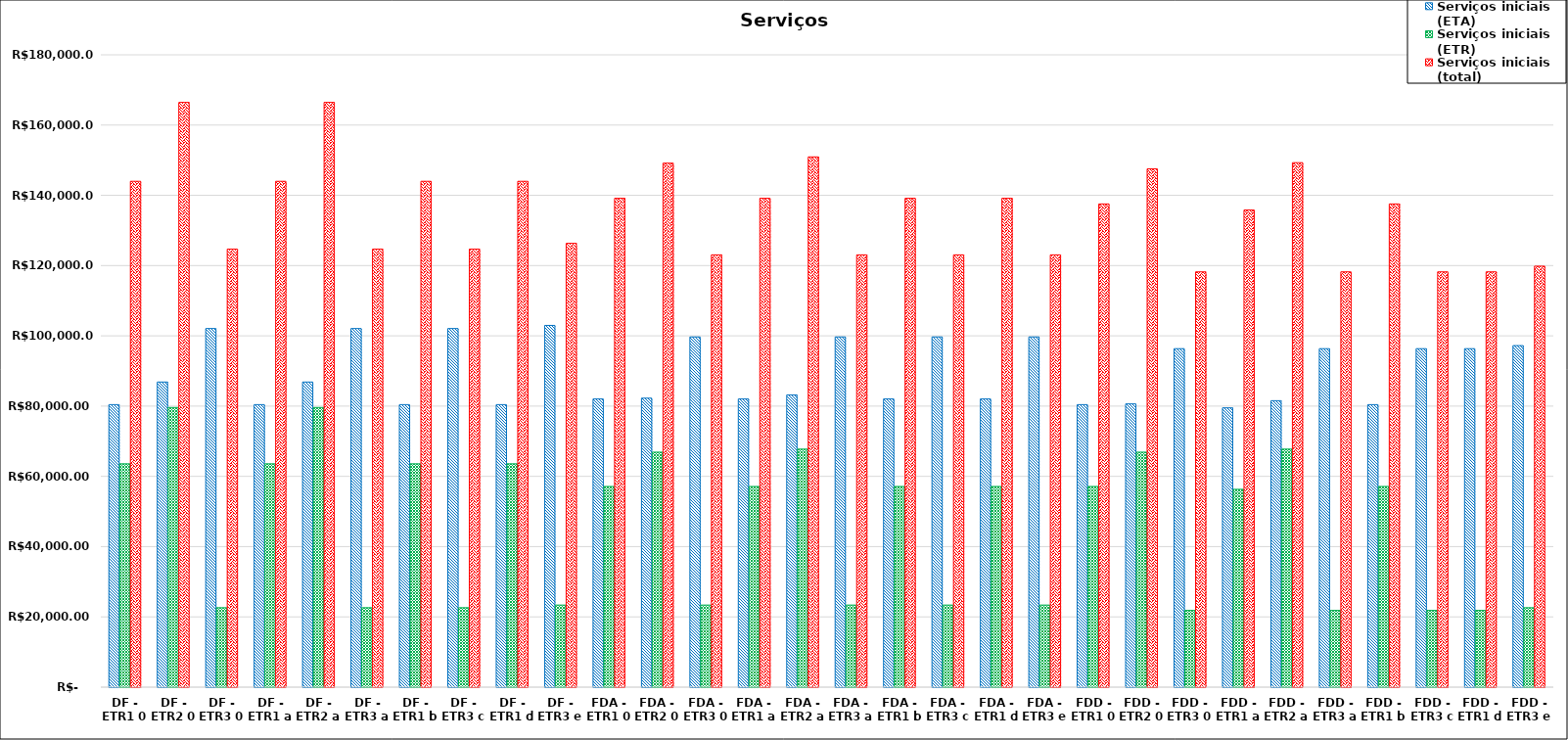
| Category | Serviços iniciais (ETA) | Serviços iniciais (ETR) | Serviços iniciais (total) |
|---|---|---|---|
| DF - ETR1 0 | 80421.026 | 63570.661 | 143991.687 |
| DF - ETR2 0 | 86855.839 | 79599.632 | 166455.471 |
| DF - ETR3 0 | 102079.858 | 22614.206 | 124694.064 |
| DF - ETR1 a | 80421.026 | 63570.661 | 143991.687 |
| DF - ETR2 a | 86855.839 | 79599.632 | 166455.471 |
| DF - ETR3 a | 102080.155 | 22614.206 | 124694.361 |
| DF - ETR1 b | 80421.026 | 63570.661 | 143991.687 |
| DF - ETR3 c | 102080.155 | 22614.206 | 124694.361 |
| DF - ETR1 d | 80421.026 | 63570.661 | 143991.687 |
| DF - ETR3 e | 102969.684 | 23364.995 | 126334.679 |
| FDA - ETR1 0 | 82031.614 | 57128.309 | 139159.923 |
| FDA - ETR2 0 | 82259.544 | 66900.847 | 149160.391 |
| FDA - ETR3 0 | 99689.048 | 23364.995 | 123054.043 |
| FDA - ETR1 a | 82031.614 | 57128.309 | 139159.923 |
| FDA - ETR2 a | 83178.803 | 67760.646 | 150939.449 |
| FDA - ETR3 a | 99689.048 | 23364.995 | 123054.043 |
| FDA - ETR1 b | 82031.614 | 57128.309 | 139159.923 |
| FDA - ETR3 c | 99689.345 | 23364.995 | 123054.34 |
| FDA - ETR1 d | 82031.614 | 57128.309 | 139159.923 |
| FDA - ETR3 e | 99689.345 | 23364.995 | 123054.34 |
| FDD - ETR1 0 | 80421.026 | 57128.309 | 137549.335 |
| FDD - ETR2 0 | 80629.136 | 66900.847 | 147529.983 |
| FDD - ETR3 0 | 96348.952 | 21863.417 | 118212.369 |
| FDD - ETR1 a | 79501.767 | 56318.06 | 135819.827 |
| FDD - ETR2 a | 81538.485 | 67760.646 | 149299.131 |
| FDD - ETR3 a | 96348.952 | 21863.417 | 118212.369 |
| FDD - ETR1 b | 80421.026 | 57128.309 | 137549.335 |
| FDD - ETR3 c | 96348.952 | 21863.417 | 118212.369 |
| FDD - ETR1 d | 96348.952 | 21863.417 | 118212.369 |
| FDD - ETR3 e | 97218.661 | 22614.206 | 119832.867 |